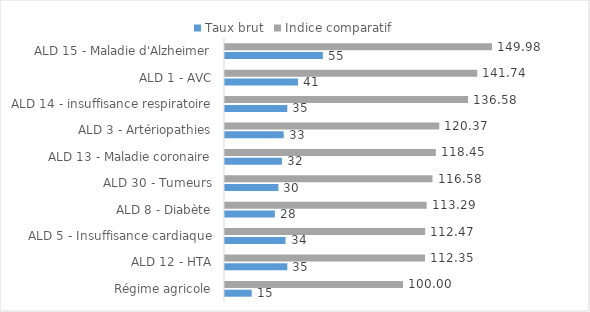
| Category | Taux brut | Indice comparatif |
|---|---|---|
| Régime agricole | 15 | 100 |
| ALD 12 - HTA | 35 | 112.35 |
| ALD 5 - Insuffisance cardiaque | 34 | 112.466 |
| ALD 8 - Diabète | 28 | 113.289 |
| ALD 30 - Tumeurs | 30 | 116.58 |
| ALD 13 - Maladie coronaire | 32 | 118.452 |
| ALD 3 - Artériopathies | 33 | 120.373 |
| ALD 14 - insuffisance respiratoire | 35 | 136.583 |
| ALD 1 - AVC | 41 | 141.735 |
| ALD 15 - Maladie d'Alzheimer | 55 | 149.985 |